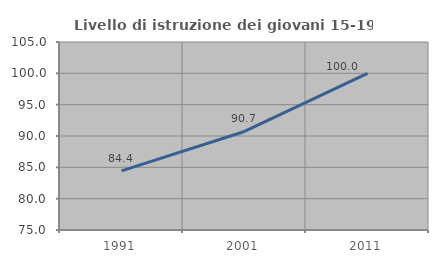
| Category | Livello di istruzione dei giovani 15-19 anni |
|---|---|
| 1991.0 | 84.434 |
| 2001.0 | 90.722 |
| 2011.0 | 100 |